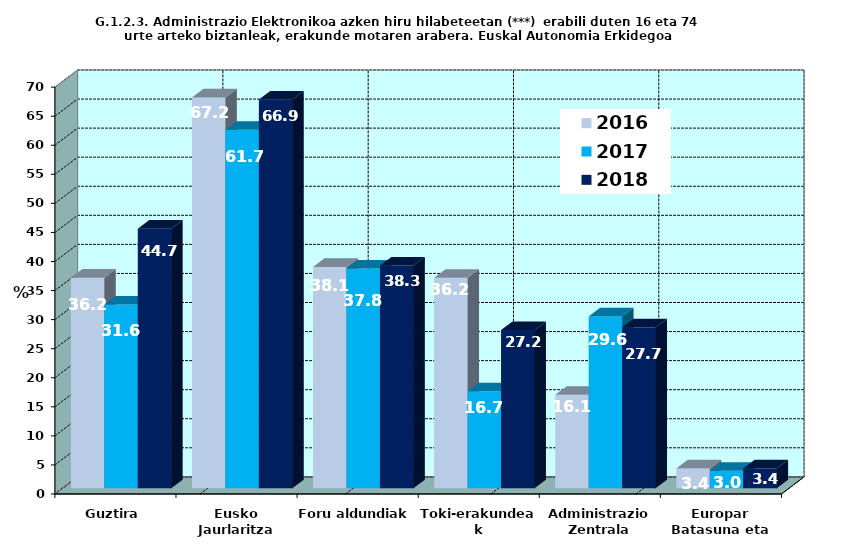
| Category | 2016 | 2017 | 2018 |
|---|---|---|---|
| Guztira | 36.231 | 31.608 | 44.663 |
| Eusko Jaurlaritza | 67.249 | 61.687 | 66.88 |
| Foru aldundiak | 38.099 | 37.801 | 38.329 |
| Toki-erakundeak | 36.213 | 16.693 | 27.228 |
| Administrazio Zentrala | 16.081 | 29.562 | 27.688 |
| Europar Batasuna eta beste batzuk | 3.41 | 3.015 | 3.426 |